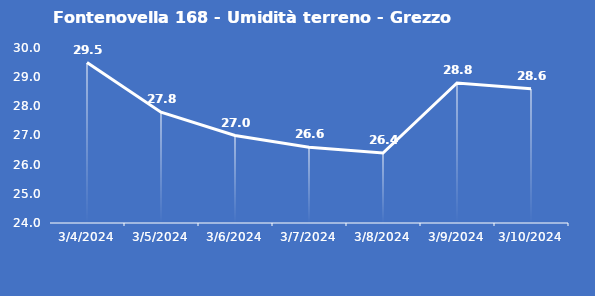
| Category | Fontenovella 168 - Umidità terreno - Grezzo (%VWC) |
|---|---|
| 3/4/24 | 29.5 |
| 3/5/24 | 27.8 |
| 3/6/24 | 27 |
| 3/7/24 | 26.6 |
| 3/8/24 | 26.4 |
| 3/9/24 | 28.8 |
| 3/10/24 | 28.6 |